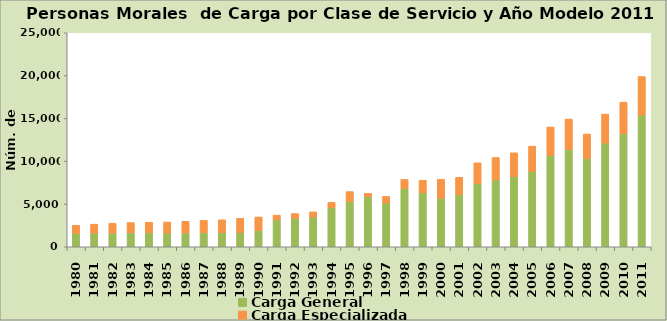
| Category | Carga General | Carga Especializada |
|---|---|---|
| 1980.0 | 1569 | 949 |
| 1981.0 | 1596 | 1046 |
| 1982.0 | 1602 | 1150 |
| 1983.0 | 1627 | 1200 |
| 1984.0 | 1626 | 1239 |
| 1985.0 | 1606 | 1289 |
| 1986.0 | 1609 | 1366 |
| 1987.0 | 1631 | 1456 |
| 1988.0 | 1633 | 1516 |
| 1989.0 | 1662 | 1675 |
| 1990.0 | 1892 | 1590 |
| 1991.0 | 3137 | 563 |
| 1992.0 | 3290 | 590 |
| 1993.0 | 3459 | 617 |
| 1994.0 | 4545 | 642 |
| 1995.0 | 5278 | 1171 |
| 1996.0 | 5841 | 398 |
| 1997.0 | 5107 | 776 |
| 1998.0 | 6812 | 1052 |
| 1999.0 | 6297 | 1486 |
| 2000.0 | 5669 | 2211 |
| 2001.0 | 6101 | 2017 |
| 2002.0 | 7351 | 2459 |
| 2003.0 | 7805 | 2627 |
| 2004.0 | 8202 | 2776 |
| 2005.0 | 8815 | 2943 |
| 2006.0 | 10632 | 3366 |
| 2007.0 | 11373 | 3550 |
| 2008.0 | 10287 | 2894 |
| 2009.0 | 12098 | 3412 |
| 2010.0 | 13210 | 3682 |
| 2011.0 | 15370 | 4517 |